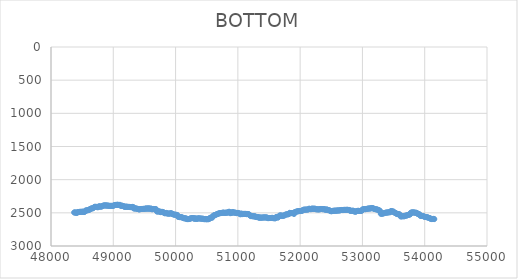
| Category | BOTTOM |
|---|---|
| 48372.0465 | 2494.61 |
| 48379.1803 | 2494.61 |
| 48389.4198 | 2494.76 |
| 48399.6598 | 2496.77 |
| 48409.8999 | 2502.76 |
| 48420.1399 | 2498.89 |
| 48430.38 | 2487.57 |
| 48440.62 | 2487.57 |
| 48450.8601 | 2487.57 |
| 48461.1001 | 2486.97 |
| 48471.3402 | 2482.55 |
| 48481.5802 | 2487.12 |
| 48491.8203 | 2483.5 |
| 48502.0603 | 2484.46 |
| 48512.3004 | 2482.09 |
| 48522.5405 | 2483.8 |
| 48532.7805 | 2487.27 |
| 48543.0206 | 2482.8 |
| 48553.2606 | 2466.31 |
| 48563.5007 | 2464.75 |
| 48573.7407 | 2462.24 |
| 48583.9808 | 2462.09 |
| 48594.2208 | 2460.53 |
| 48604.4609 | 2458.01 |
| 48614.7009 | 2456.2 |
| 48624.941 | 2441.12 |
| 48635.181 | 2440.67 |
| 48645.4211 | 2436.3 |
| 48655.6611 | 2431.57 |
| 48665.9012 | 2433.63 |
| 48676.1412 | 2429.11 |
| 48686.3813 | 2421.61 |
| 48696.6213 | 2411.11 |
| 48706.8614 | 2407.79 |
| 48717.1014 | 2411.26 |
| 48727.3415 | 2409.35 |
| 48737.5815 | 2414.53 |
| 48747.8216 | 2415.79 |
| 48758.0616 | 2414.27 |
| 48768.3017 | 2401.71 |
| 48778.5417 | 2401.86 |
| 48788.7818 | 2403.57 |
| 48799.0218 | 2407.34 |
| 48809.2619 | 2406.73 |
| 48819.5019 | 2401.1 |
| 48829.742 | 2395.63 |
| 48839.982 | 2391.4 |
| 48850.2221 | 2387.79 |
| 48860.4621 | 2389.04 |
| 48870.7022 | 2388.74 |
| 48880.9422 | 2386.98 |
| 48891.1823 | 2392.66 |
| 48901.4223 | 2388.09 |
| 48911.6624 | 2391.86 |
| 48921.9025 | 2392.16 |
| 48932.1425 | 2394.67 |
| 48942.3826 | 2394.67 |
| 48952.6226 | 2394.67 |
| 48962.8627 | 2394.67 |
| 48973.1027 | 2394.67 |
| 48983.3428 | 2394.82 |
| 48993.5828 | 2395.62 |
| 49003.8229 | 2391.4 |
| 49014.0629 | 2387.18 |
| 49024.303 | 2383.11 |
| 49034.543 | 2380.6 |
| 49044.7831 | 2380.6 |
| 49055.0231 | 2380.29 |
| 49065.2632 | 2377.78 |
| 49075.5032 | 2378.24 |
| 49085.7433 | 2382 |
| 49095.9833 | 2381.55 |
| 49106.2234 | 2379.3 |
| 49116.4634 | 2392.31 |
| 49126.7035 | 2395.62 |
| 49136.9435 | 2392.01 |
| 49147.1836 | 2393.57 |
| 49157.4236 | 2396.38 |
| 49167.6637 | 2400.11 |
| 49177.9037 | 2410 |
| 49188.1438 | 2408.75 |
| 49198.3838 | 2408.29 |
| 49208.6239 | 2404.98 |
| 49218.8639 | 2408.9 |
| 49229.104 | 2410.16 |
| 49239.344 | 2410.16 |
| 49249.5841 | 2410.16 |
| 49259.8241 | 2410.61 |
| 49270.0642 | 2414.23 |
| 49280.3042 | 2413.12 |
| 49290.5443 | 2414.53 |
| 49300.7843 | 2415.18 |
| 49311.0244 | 2410.16 |
| 49321.2645 | 2413.04 |
| 49331.5045 | 2436.44 |
| 49341.7446 | 2432.68 |
| 49351.9846 | 2432.83 |
| 49362.2247 | 2434.39 |
| 49372.4647 | 2437.05 |
| 49382.7048 | 2438.46 |
| 49392.9448 | 2440.17 |
| 49403.1849 | 2444.55 |
| 49413.4249 | 2449.42 |
| 49423.665 | 2447.7 |
| 49433.905 | 2443.79 |
| 49444.1451 | 2442.53 |
| 49454.3851 | 2442.38 |
| 49464.6252 | 2441.12 |
| 49474.8652 | 2441.12 |
| 49485.1053 | 2440.82 |
| 49495.3453 | 2438.46 |
| 49505.5854 | 2439.72 |
| 49515.8254 | 2438.95 |
| 49526.0655 | 2432.68 |
| 49536.3055 | 2433.44 |
| 49546.5456 | 2439.41 |
| 49556.7856 | 2436.14 |
| 49567.0257 | 2430.47 |
| 49577.2657 | 2435.95 |
| 49587.5058 | 2439.41 |
| 49597.7458 | 2436.6 |
| 49607.9859 | 2435.3 |
| 49618.2259 | 2445.5 |
| 49628.466 | 2446.45 |
| 49638.706 | 2443.63 |
| 49648.9461 | 2441.58 |
| 49659.1861 | 2445.04 |
| 49669.4262 | 2442.68 |
| 49679.6662 | 2443.94 |
| 49689.9063 | 2447.91 |
| 49700.1464 | 2480.54 |
| 49710.3864 | 2480.08 |
| 49720.6265 | 2476.62 |
| 49730.8665 | 2479.13 |
| 49741.1066 | 2479.43 |
| 49751.3466 | 2482.86 |
| 49761.5867 | 2490.08 |
| 49771.8267 | 2487.12 |
| 49782.0668 | 2484.12 |
| 49792.3068 | 2490.24 |
| 49802.5469 | 2489.75 |
| 49812.7869 | 2497.09 |
| 49823.027 | 2505.87 |
| 49833.267 | 2505.87 |
| 49843.5071 | 2505.26 |
| 49853.7471 | 2501.31 |
| 49863.9872 | 2510.1 |
| 49874.2272 | 2510.25 |
| 49884.4673 | 2511.5 |
| 49894.7073 | 2511.5 |
| 49904.9474 | 2511.5 |
| 49915.1874 | 2510.74 |
| 49925.4275 | 2504.62 |
| 49935.6675 | 2507.1 |
| 49945.9076 | 2517.13 |
| 49956.1476 | 2518.05 |
| 49966.3877 | 2525.73 |
| 49976.6277 | 2526.99 |
| 49986.8678 | 2527.29 |
| 49997.1078 | 2529.65 |
| 50007.3479 | 2528.7 |
| 50017.5879 | 2530.9 |
| 50027.828 | 2531.76 |
| 50038.068 | 2559.21 |
| 50048.3081 | 2558.41 |
| 50058.5482 | 2562.64 |
| 50068.7882 | 2566.09 |
| 50079.0283 | 2563.74 |
| 50089.2683 | 2565.15 |
| 50099.5084 | 2566.86 |
| 50109.7484 | 2571.08 |
| 50119.9885 | 2575.31 |
| 50130.2285 | 2579.53 |
| 50140.4686 | 2583.45 |
| 50150.7086 | 2584.39 |
| 50160.9487 | 2582.04 |
| 50171.1887 | 2584.52 |
| 50181.4288 | 2594.55 |
| 50191.6688 | 2594.55 |
| 50201.9089 | 2594.55 |
| 50212.1489 | 2594.25 |
| 50222.389 | 2591.28 |
| 50232.629 | 2587.05 |
| 50242.8691 | 2583.29 |
| 50253.1091 | 2582.83 |
| 50263.3492 | 2579.22 |
| 50273.5892 | 2580.32 |
| 50283.8293 | 2579.22 |
| 50294.0693 | 2582.01 |
| 50304.3094 | 2593.02 |
| 50314.5494 | 2581.09 |
| 50324.7895 | 2586.72 |
| 50335.0295 | 2591.74 |
| 50345.2696 | 2590.82 |
| 50355.5096 | 2583.29 |
| 50365.7497 | 2583.29 |
| 50375.9897 | 2583.45 |
| 50386.2298 | 2584.85 |
| 50396.4698 | 2586.11 |
| 50406.7099 | 2586.41 |
| 50416.9499 | 2588.77 |
| 50427.19 | 2587.67 |
| 50437.4301 | 2588.92 |
| 50447.6701 | 2589.69 |
| 50457.9102 | 2595.96 |
| 50468.1502 | 2595.5 |
| 50478.3903 | 2592.35 |
| 50488.6303 | 2597.21 |
| 50498.8704 | 2595.96 |
| 50509.1104 | 2595.96 |
| 50519.3505 | 2595.96 |
| 50529.5905 | 2595.96 |
| 50539.8306 | 2593.81 |
| 50550.0706 | 2576.1 |
| 50560.3107 | 2574.85 |
| 50570.5507 | 2574.54 |
| 50580.7908 | 2572.34 |
| 50591.0308 | 2571.61 |
| 50601.2709 | 2544.98 |
| 50611.5109 | 2541.7 |
| 50621.751 | 2535.28 |
| 50631.991 | 2533.72 |
| 50642.2311 | 2530.44 |
| 50652.4711 | 2524.02 |
| 50662.7112 | 2522.3 |
| 50672.9512 | 2517.93 |
| 50683.1913 | 2512.6 |
| 50693.4313 | 2509.63 |
| 50703.6714 | 2505.87 |
| 50713.9114 | 2505.72 |
| 50724.1515 | 2504.31 |
| 50734.3915 | 2502.9 |
| 50744.6316 | 2501.19 |
| 50754.8716 | 2497.43 |
| 50765.1117 | 2497.27 |
| 50775.3518 | 2496.64 |
| 50785.5918 | 2501.5 |
| 50795.8319 | 2500.09 |
| 50806.0719 | 2498.53 |
| 50816.312 | 2496.17 |
| 50826.552 | 2497.27 |
| 50836.7921 | 2495.87 |
| 50847.0321 | 2493.38 |
| 50857.2722 | 2483.35 |
| 50867.5122 | 2485.82 |
| 50877.7523 | 2505.56 |
| 50887.9923 | 2503.21 |
| 50898.2324 | 2502.92 |
| 50908.4724 | 2489.93 |
| 50918.7125 | 2487.25 |
| 50928.9525 | 2496.02 |
| 50939.1926 | 2496.17 |
| 50949.4326 | 2497.27 |
| 50959.6727 | 2496.48 |
| 50969.9127 | 2500.86 |
| 50980.1528 | 2505.56 |
| 50990.3928 | 2502.75 |
| 51000.6329 | 2500.4 |
| 51010.8729 | 2502.73 |
| 51021.113 | 2511.5 |
| 51031.353 | 2512.89 |
| 51041.5931 | 2522.78 |
| 51051.8331 | 2511.5 |
| 51062.0732 | 2512.43 |
| 51072.3132 | 2519.64 |
| 51082.5533 | 2516.98 |
| 51092.7933 | 2515.73 |
| 51103.0334 | 2515.73 |
| 51113.2735 | 2515.73 |
| 51123.5135 | 2515.73 |
| 51133.7536 | 2516.35 |
| 51143.9936 | 2520.89 |
| 51154.2337 | 2517.29 |
| 51164.4737 | 2518.54 |
| 51174.7138 | 2519.78 |
| 51184.9538 | 2530.11 |
| 51195.1939 | 2534.48 |
| 51205.4339 | 2549.51 |
| 51215.674 | 2549.51 |
| 51225.914 | 2549.66 |
| 51236.1541 | 2551.07 |
| 51246.3941 | 2552.32 |
| 51256.6342 | 2552.48 |
| 51266.8742 | 2553.42 |
| 51277.1143 | 2552 |
| 51287.3543 | 2561.08 |
| 51297.5944 | 2563.59 |
| 51307.8344 | 2563.43 |
| 51318.0745 | 2562.49 |
| 51328.3145 | 2566.23 |
| 51338.5546 | 2575.17 |
| 51348.7946 | 2567.18 |
| 51359.0347 | 2573.44 |
| 51369.2747 | 2573.28 |
| 51379.5148 | 2572.03 |
| 51389.7548 | 2571.88 |
| 51399.9949 | 2570.62 |
| 51410.2349 | 2570.47 |
| 51420.475 | 2569.22 |
| 51430.715 | 2569.22 |
| 51440.9551 | 2569.22 |
| 51451.1952 | 2569.37 |
| 51461.4352 | 2570.62 |
| 51471.6753 | 2571.71 |
| 51481.9153 | 2580.32 |
| 51492.1554 | 2579.07 |
| 51502.3954 | 2578.91 |
| 51512.6355 | 2577.66 |
| 51522.8755 | 2577.66 |
| 51533.1156 | 2577.66 |
| 51543.3556 | 2577.2 |
| 51553.5957 | 2574.22 |
| 51563.8357 | 2580.48 |
| 51574.0758 | 2580.48 |
| 51584.3158 | 2580.79 |
| 51594.5559 | 2583.29 |
| 51604.7959 | 2580.96 |
| 51615.036 | 2562.02 |
| 51625.276 | 2561.86 |
| 51635.5161 | 2570.78 |
| 51645.7561 | 2570.63 |
| 51655.9962 | 2557.5 |
| 51666.2362 | 2542.32 |
| 51676.4763 | 2540.91 |
| 51686.7163 | 2539.35 |
| 51696.9564 | 2538.09 |
| 51707.1964 | 2547.79 |
| 51717.4365 | 2545.13 |
| 51727.6765 | 2543.72 |
| 51737.9166 | 2542.32 |
| 51748.1566 | 2539.82 |
| 51758.3967 | 2529.49 |
| 51768.6367 | 2526.52 |
| 51778.8768 | 2522.76 |
| 51789.1169 | 2522.76 |
| 51799.3569 | 2522.61 |
| 51809.597 | 2521.2 |
| 51819.837 | 2517.61 |
| 51830.0771 | 2499.61 |
| 51840.3171 | 2505.72 |
| 51850.5572 | 2504.47 |
| 51860.7972 | 2504.47 |
| 51871.0373 | 2504.31 |
| 51881.2773 | 2502.9 |
| 51891.5174 | 2503.83 |
| 51901.7574 | 2517.77 |
| 51911.9975 | 2488.98 |
| 51922.2375 | 2488.51 |
| 51932.4776 | 2484.29 |
| 51942.7176 | 2480.38 |
| 51952.9577 | 2478.82 |
| 51963.1977 | 2476.31 |
| 51973.4378 | 2476 |
| 51983.6778 | 2473.5 |
| 51993.9179 | 2473.5 |
| 52004.1579 | 2473.19 |
| 52014.398 | 2470.68 |
| 52024.638 | 2470.68 |
| 52034.8781 | 2468.97 |
| 52045.1181 | 2455.2 |
| 52055.3582 | 2454.73 |
| 52065.5982 | 2450.98 |
| 52075.8383 | 2451.29 |
| 52086.0783 | 2453.48 |
| 52096.3184 | 2450.98 |
| 52106.5585 | 2450.82 |
| 52116.7985 | 2449.72 |
| 52127.0386 | 2450.51 |
| 52137.2786 | 2445.5 |
| 52147.5187 | 2436.43 |
| 52157.7587 | 2444.09 |
| 52167.9988 | 2445.35 |
| 52178.2388 | 2444.41 |
| 52188.4789 | 2436.59 |
| 52198.7189 | 2435.02 |
| 52208.959 | 2442.53 |
| 52219.199 | 2441.44 |
| 52229.4391 | 2433.77 |
| 52239.6791 | 2442.53 |
| 52249.9192 | 2443.16 |
| 52260.1592 | 2448 |
| 52270.3993 | 2446.75 |
| 52280.6393 | 2446.91 |
| 52290.8794 | 2448.16 |
| 52301.1194 | 2448.16 |
| 52311.3595 | 2447.85 |
| 52321.5995 | 2444.88 |
| 52331.8396 | 2441.28 |
| 52342.0796 | 2442.53 |
| 52352.3197 | 2442.84 |
| 52362.5597 | 2445.5 |
| 52372.7998 | 2446.28 |
| 52383.0398 | 2443 |
| 52393.2799 | 2447.54 |
| 52403.5199 | 2453.79 |
| 52413.76 | 2453.17 |
| 52424.0001 | 2448.32 |
| 52434.2401 | 2450.67 |
| 52444.4802 | 2459.42 |
| 52454.7202 | 2459.58 |
| 52464.9603 | 2461.14 |
| 52475.2003 | 2464.43 |
| 52485.4404 | 2471.31 |
| 52495.6804 | 2476.31 |
| 52505.9205 | 2475.84 |
| 52516.1605 | 2471.78 |
| 52526.4006 | 2469.28 |
| 52536.6406 | 2469.28 |
| 52546.8807 | 2468.96 |
| 52557.1207 | 2466.46 |
| 52567.3608 | 2466.93 |
| 52577.6008 | 2470.06 |
| 52587.8409 | 2464.9 |
| 52598.0809 | 2463.8 |
| 52608.321 | 2465.05 |
| 52618.561 | 2464.9 |
| 52628.8011 | 2463.64 |
| 52639.0411 | 2463.17 |
| 52649.2812 | 2459.27 |
| 52659.5212 | 2457.86 |
| 52669.7613 | 2456.76 |
| 52680.0013 | 2458.17 |
| 52690.2414 | 2458.95 |
| 52700.4814 | 2455.2 |
| 52710.7215 | 2455.2 |
| 52720.9615 | 2455.2 |
| 52731.2016 | 2455.2 |
| 52741.4417 | 2455.04 |
| 52751.6817 | 2453.79 |
| 52761.9218 | 2454.11 |
| 52772.1618 | 2456.61 |
| 52782.4019 | 2456.45 |
| 52792.6419 | 2456.93 |
| 52802.882 | 2470.53 |
| 52813.122 | 2469.28 |
| 52823.3621 | 2469.28 |
| 52833.6021 | 2469.12 |
| 52843.8422 | 2467.87 |
| 52854.0822 | 2468.81 |
| 52864.3223 | 2476.79 |
| 52874.5623 | 2480.69 |
| 52884.8024 | 2482.1 |
| 52895.0424 | 2482.41 |
| 52905.2825 | 2474.59 |
| 52915.5225 | 2471.78 |
| 52925.7626 | 2469.28 |
| 52936.0026 | 2469.59 |
| 52946.2427 | 2472.09 |
| 52956.4827 | 2471.93 |
| 52966.7228 | 2470.84 |
| 52976.9628 | 2472.09 |
| 52987.2029 | 2469.57 |
| 52997.4429 | 2449.57 |
| 53007.683 | 2449.1 |
| 53017.923 | 2445.35 |
| 53028.1631 | 2445.03 |
| 53038.4031 | 2443 |
| 53048.6432 | 2446.28 |
| 53058.8833 | 2442.37 |
| 53069.1233 | 2440.97 |
| 53079.3634 | 2439.24 |
| 53089.6034 | 2435.49 |
| 53099.8435 | 2435.49 |
| 53110.0835 | 2435.33 |
| 53120.3236 | 2434.08 |
| 53130.5636 | 2433.77 |
| 53140.8037 | 2430.8 |
| 53151.0437 | 2427.05 |
| 53161.2838 | 2427.52 |
| 53171.5238 | 2432.06 |
| 53181.7639 | 2438.47 |
| 53192.0039 | 2440.19 |
| 53202.244 | 2444.25 |
| 53212.484 | 2446.75 |
| 53222.7241 | 2446.91 |
| 53232.9641 | 2448.63 |
| 53243.2042 | 2452.7 |
| 53253.4442 | 2455.67 |
| 53263.6843 | 2459.9 |
| 53273.9243 | 2464.12 |
| 53284.1644 | 2473.08 |
| 53294.4044 | 2514.16 |
| 53304.6445 | 2512.91 |
| 53314.8845 | 2512.75 |
| 53325.1246 | 2511.35 |
| 53335.3646 | 2509.62 |
| 53345.6047 | 2505.56 |
| 53355.8448 | 2502.74 |
| 53366.0848 | 2499.77 |
| 53376.3249 | 2496.18 |
| 53386.5649 | 2497.27 |
| 53396.805 | 2495.86 |
| 53407.045 | 2494.3 |
| 53417.2851 | 2491.8 |
| 53427.5251 | 2491.8 |
| 53437.7652 | 2491.8 |
| 53448.0052 | 2489.58 |
| 53458.2453 | 2472.25 |
| 53468.4853 | 2474.13 |
| 53478.7254 | 2479.29 |
| 53488.9654 | 2480.38 |
| 53499.2055 | 2480.71 |
| 53509.4455 | 2493.84 |
| 53519.6856 | 2498.99 |
| 53529.9256 | 2500.56 |
| 53540.1657 | 2504.8 |
| 53550.4057 | 2518.38 |
| 53560.6458 | 2517.13 |
| 53570.8858 | 2517.45 |
| 53581.1259 | 2520.11 |
| 53591.3659 | 2521.52 |
| 53601.606 | 2526.25 |
| 53611.846 | 2553.73 |
| 53622.0861 | 2553.57 |
| 53632.3261 | 2552.32 |
| 53642.5662 | 2552.01 |
| 53652.8063 | 2549.83 |
| 53663.0463 | 2552.32 |
| 53673.2864 | 2551.53 |
| 53683.5264 | 2544.81 |
| 53693.7665 | 2541.06 |
| 53704.0065 | 2541.06 |
| 53714.2466 | 2540.27 |
| 53724.4866 | 2533.87 |
| 53734.7267 | 2531.98 |
| 53744.9667 | 2526.99 |
| 53755.2068 | 2526.99 |
| 53765.4468 | 2523.82 |
| 53775.6869 | 2498.68 |
| 53785.9269 | 2496.95 |
| 53796.167 | 2493.2 |
| 53806.407 | 2493.2 |
| 53816.6471 | 2493.36 |
| 53826.8871 | 2494.77 |
| 53837.1272 | 2496.34 |
| 53847.3672 | 2498.84 |
| 53857.6073 | 2498.84 |
| 53867.8473 | 2499.15 |
| 53878.0874 | 2503.56 |
| 53888.3274 | 2518.54 |
| 53898.5675 | 2518.86 |
| 53908.8075 | 2521.2 |
| 53919.0476 | 2522.81 |
| 53929.2876 | 2545.29 |
| 53939.5277 | 2545.45 |
| 53949.7678 | 2546.85 |
| 53960.0078 | 2548.1 |
| 53970.2479 | 2548.26 |
| 53980.4879 | 2550.46 |
| 53990.728 | 2558.11 |
| 54000.968 | 2559.68 |
| 54011.2081 | 2562.18 |
| 54021.4481 | 2562.5 |
| 54031.6882 | 2565.31 |
| 54041.9282 | 2567.97 |
| 54052.1683 | 2569.85 |
| 54062.4083 | 2575.16 |
| 54072.6484 | 2577.82 |
| 54082.8884 | 2580.5 |
| 54093.1285 | 2591.26 |
| 54103.3685 | 2588.31 |
| 54113.6086 | 2594.39 |
| 54123.8486 | 2592.99 |
| 54134.0887 | 2591.58 |
| 54144.3287 | 2590.84 |
| 54153.8603 | 2594.55 |